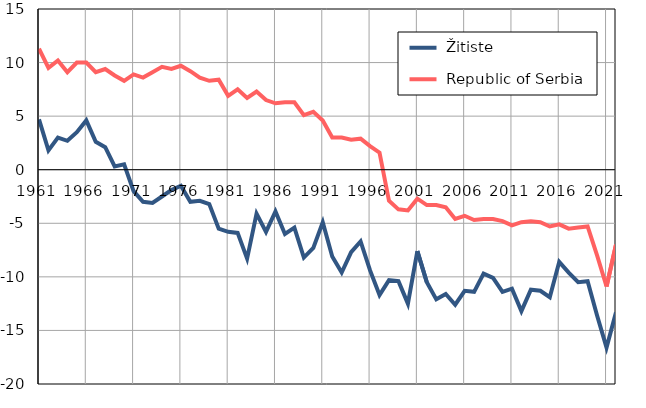
| Category |  Žitiste |  Republic of Serbia |
|---|---|---|
| 1961.0 | 4.7 | 11.3 |
| 1962.0 | 1.8 | 9.5 |
| 1963.0 | 3 | 10.2 |
| 1964.0 | 2.7 | 9.1 |
| 1965.0 | 3.5 | 10 |
| 1966.0 | 4.6 | 10 |
| 1967.0 | 2.6 | 9.1 |
| 1968.0 | 2.1 | 9.4 |
| 1969.0 | 0.3 | 8.8 |
| 1970.0 | 0.5 | 8.3 |
| 1971.0 | -2 | 8.9 |
| 1972.0 | -3 | 8.6 |
| 1973.0 | -3.1 | 9.1 |
| 1974.0 | -2.5 | 9.6 |
| 1975.0 | -1.9 | 9.4 |
| 1976.0 | -1.5 | 9.7 |
| 1977.0 | -3 | 9.2 |
| 1978.0 | -2.9 | 8.6 |
| 1979.0 | -3.2 | 8.3 |
| 1980.0 | -5.5 | 8.4 |
| 1981.0 | -5.8 | 6.9 |
| 1982.0 | -5.9 | 7.5 |
| 1983.0 | -8.3 | 6.7 |
| 1984.0 | -4.1 | 7.3 |
| 1985.0 | -5.8 | 6.5 |
| 1986.0 | -3.9 | 6.2 |
| 1987.0 | -6 | 6.3 |
| 1988.0 | -5.4 | 6.3 |
| 1989.0 | -8.2 | 5.1 |
| 1990.0 | -7.3 | 5.4 |
| 1991.0 | -4.9 | 4.6 |
| 1992.0 | -8.1 | 3 |
| 1993.0 | -9.6 | 3 |
| 1994.0 | -7.7 | 2.8 |
| 1995.0 | -6.7 | 2.9 |
| 1996.0 | -9.4 | 2.2 |
| 1997.0 | -11.7 | 1.6 |
| 1998.0 | -10.3 | -2.9 |
| 1999.0 | -10.4 | -3.7 |
| 2000.0 | -12.5 | -3.8 |
| 2001.0 | -7.6 | -2.7 |
| 2002.0 | -10.5 | -3.3 |
| 2003.0 | -12.1 | -3.3 |
| 2004.0 | -11.6 | -3.5 |
| 2005.0 | -12.6 | -4.6 |
| 2006.0 | -11.3 | -4.3 |
| 2007.0 | -11.4 | -4.7 |
| 2008.0 | -9.7 | -4.6 |
| 2009.0 | -10.1 | -4.6 |
| 2010.0 | -11.4 | -4.8 |
| 2011.0 | -11.1 | -5.2 |
| 2012.0 | -13.2 | -4.9 |
| 2013.0 | -11.2 | -4.8 |
| 2014.0 | -11.3 | -4.9 |
| 2015.0 | -11.9 | -5.3 |
| 2016.0 | -8.6 | -5.1 |
| 2017.0 | -9.6 | -5.5 |
| 2018.0 | -10.5 | -5.4 |
| 2019.0 | -10.4 | -5.3 |
| 2020.0 | -13.6 | -8 |
| 2021.0 | -16.6 | -10.9 |
| 2022.0 | -13.3 | -7 |